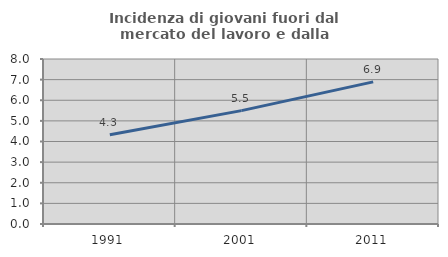
| Category | Incidenza di giovani fuori dal mercato del lavoro e dalla formazione  |
|---|---|
| 1991.0 | 4.327 |
| 2001.0 | 5.496 |
| 2011.0 | 6.892 |